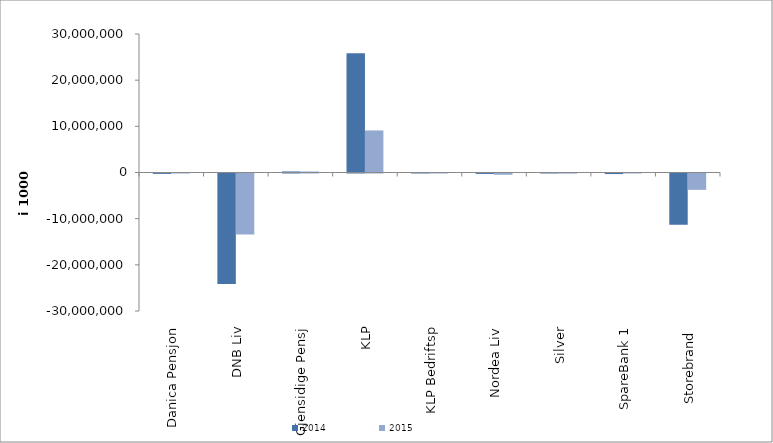
| Category | 2014 | 2015 |
|---|---|---|
| Danica Pensjon | -86112.116 | -4357.268 |
| DNB Liv | -23944996 | -13223570 |
| Gjensidige Pensj | 225594.216 | 219040.415 |
| KLP | 25815769.479 | 9108692.853 |
| KLP Bedriftsp | 88952 | 2807 |
| Nordea Liv | -92220 | -273970.863 |
| Silver | 85543.485 | -26528.197 |
| SpareBank 1 | -121161.431 | 56365.879 |
| Storebrand  | -11087451.972 | -3542779.447 |